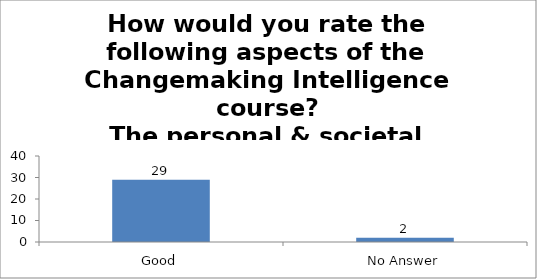
| Category | How would you rate the following aspects of the Changemaking Intelligence course?
The personal & societal outcomes of the course. |
|---|---|
| Good | 29 |
| No Answer | 2 |